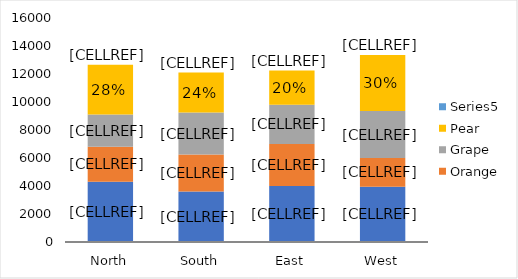
| Category | Apple | Orange | Grape | Pear | Series 4 |
|---|---|---|---|---|---|
| North | 4300 | 2500 | 2300 | 3560 |  |
| South | 3600 | 2650 | 3000 | 2850 |  |
| East | 4000 | 3000 | 2800 | 2450 |  |
| West | 3950 | 2050 | 3350 | 4000 |  |